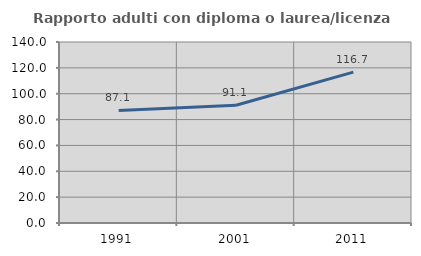
| Category | Rapporto adulti con diploma o laurea/licenza media  |
|---|---|
| 1991.0 | 87.109 |
| 2001.0 | 91.071 |
| 2011.0 | 116.667 |